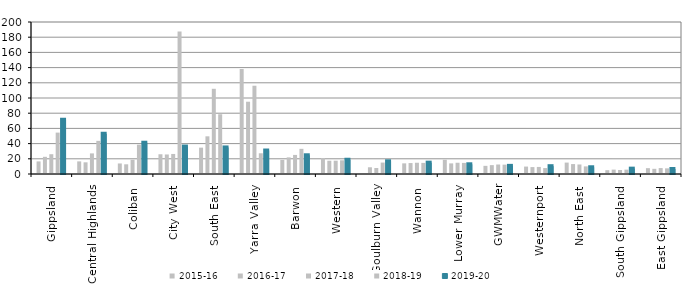
| Category | 2015-16 | 2016-17 | 2017-18 | 2018-19 | 2019-20 |
|---|---|---|---|---|---|
| Gippsland  | 16.578 | 22.601 | 26.05 | 54.47 | 71.38 |
| Central Highlands  | 16.597 | 15.362 | 27.112 | 43.611 | 52.954 |
| Coliban  | 13.863 | 12.746 | 18.725 | 38.585 | 41.145 |
| City West  | 25.976 | 25.712 | 26.372 | 187.599 | 36.122 |
| South East  | 34.69 | 49.568 | 112.104 | 78.63 | 34.942 |
| Yarra Valley  | 138.131 | 95.113 | 116.13 | 27.28 | 30.904 |
| Barwon  | 18.573 | 21.891 | 25.098 | 33.122 | 24.636 |
| Western  | 21.027 | 17.448 | 17.488 | 18.021 | 18.752 |
| Goulburn Valley  | 0 | 8.842 | 7.877 | 15.04 | 16.709 |
| Wannon  | 14.002 | 14.409 | 14.807 | 14.616 | 14.931 |
| Lower Murray  | 18.735 | 13.976 | 14.802 | 14.59 | 12.789 |
| GWMWater | 10.728 | 11.677 | 12.492 | 12.293 | 10.705 |
| Westernport  | 9.773 | 9.104 | 9.297 | 7.811 | 10.281 |
| North East  | 15.005 | 13.062 | 12.532 | 10.023 | 8.856 |
| South Gippsland  | 5.025 | 5.766 | 5.301 | 5.718 | 7.04 |
| East Gippsland  | 7.675 | 6.807 | 7.81 | 7.433 | 6.556 |